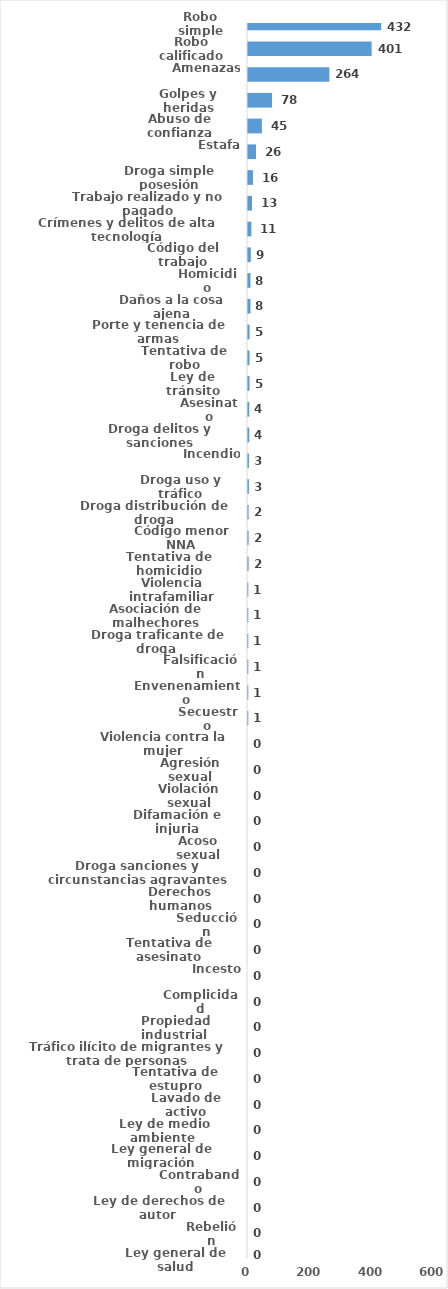
| Category | Series 0 |
|---|---|
| Robo simple | 432 |
| Robo calificado | 401 |
| Amenazas | 264 |
| Golpes y heridas | 78 |
| Abuso de confianza | 45 |
| Estafa | 26 |
| Droga simple posesión | 16 |
| Trabajo realizado y no pagado | 13 |
| Crímenes y delitos de alta tecnología | 11 |
| Código del trabajo | 9 |
| Homicidio | 8 |
| Daños a la cosa ajena | 8 |
| Porte y tenencia de armas | 5 |
| Tentativa de robo | 5 |
| Ley de tránsito | 5 |
| Asesinato | 4 |
| Droga delitos y sanciones | 4 |
| Incendio | 3 |
| Droga uso y tráfico | 3 |
| Droga distribución de droga | 2 |
| Código menor NNA | 2 |
| Tentativa de homicidio | 2 |
| Violencia intrafamiliar | 1 |
| Asociación de malhechores | 1 |
| Droga traficante de droga  | 1 |
| Falsificación | 1 |
| Envenenamiento | 1 |
| Secuestro | 1 |
| Violencia contra la mujer | 0 |
| Agresión sexual | 0 |
| Violación sexual | 0 |
| Difamación e injuria | 0 |
| Acoso sexual | 0 |
| Droga sanciones y circunstancias agravantes | 0 |
| Derechos humanos | 0 |
| Seducción | 0 |
| Tentativa de asesinato | 0 |
| Incesto | 0 |
| Complicidad | 0 |
| Propiedad industrial  | 0 |
| Tráfico ilícito de migrantes y trata de personas | 0 |
| Tentativa de estupro | 0 |
| Lavado de activo | 0 |
| Ley de medio ambiente  | 0 |
| Ley general de migración | 0 |
| Contrabando | 0 |
| Ley de derechos de autor  | 0 |
| Rebelión | 0 |
| Ley general de salud | 0 |